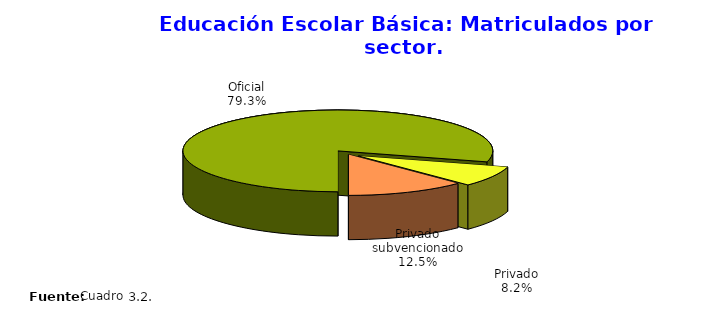
| Category | Series 0 |
|---|---|
| Oficial | 780323 |
| Privado | 80432 |
| Privado subvencionado | 122882 |